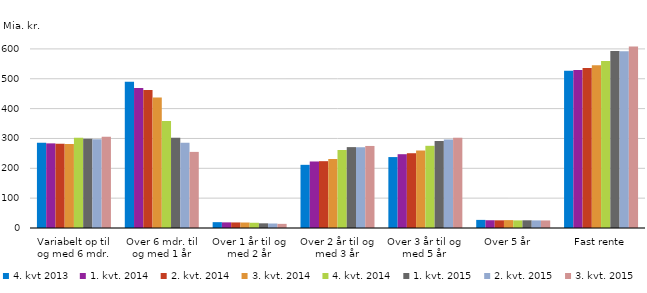
| Category | 4. kvt 2013 | 1. kvt. 2014 | 2. kvt. 2014 | 3. kvt. 2014 | 4. kvt. 2014 | 1. kvt. 2015 | 2. kvt. 2015 | 3. kvt. 2015 |
|---|---|---|---|---|---|---|---|---|
| Variabelt op til og med 6 mdr. | 285531120649.924 | 283535923063.73 | 282312458579.01 | 281358773015.22 | 302057068190.05 | 298988883578 | 297758928405.83 | 306140979156.29 |
| Over 6 mdr. til og med 1 år | 490179151830.594 | 469322683295.301 | 462546475959.52 | 437511399837.58 | 358339839485.21 | 302632403244.4 | 285638694414.9 | 255005695728.2 |
| Over 1 år til og med 2 år | 19555122059.232 | 18862294956.78 | 18616313143.86 | 18394729169.29 | 17590630611.3 | 15699457819.55 | 15038883298.24 | 13905118641.52 |
| Over 2 år til og med 3 år | 211670865834.518 | 222879270251.97 | 223889616266.39 | 231142147871.55 | 261277499867.03 | 270993250519.35 | 270564076334.03 | 274930132325.11 |
| Over 3 år til og med 5 år | 237649281202.396 | 247233873088.42 | 250551128767.18 | 259657631548.65 | 275375231084.26 | 291425959515.86 | 296476735451.719 | 302575147314.249 |
| Over 5 år   | 27165618980.769 | 25998863304.33 | 25731438329.89 | 26386359693.87 | 25514430186.66 | 25802171811.52 | 25417744685.81 | 25280655201.95 |
| Fast rente | 526779251467.59 | 529343196986.6 | 536169829711.53 | 545662746489.38 | 559912903412.6 | 592788096716.76 | 592451496439.78 | 608053094304.829 |